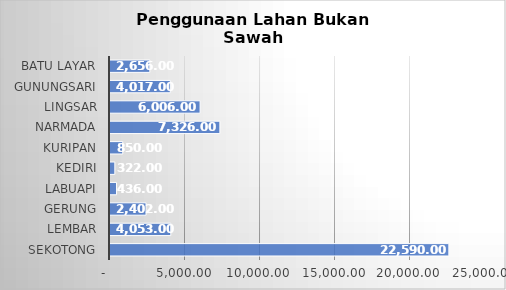
| Category | Series 0 |
|---|---|
| SEKOTONG | 22590 |
| LEMBAR | 4053 |
| GERUNG | 2402 |
| LABUAPI | 436 |
|  KEDIRI | 322 |
| KURIPAN | 850 |
|  NARMADA | 7326 |
|  LINGSAR | 6006 |
|  GUNUNGSARI | 4017 |
|  BATU LAYAR | 2656 |